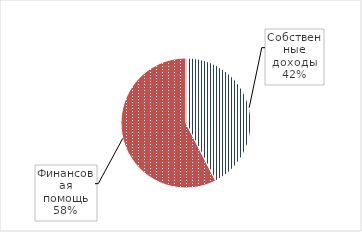
| Category | Series 0 |
|---|---|
| Собственные доходы | 397138 |
| Финансовая помощь | 538604 |